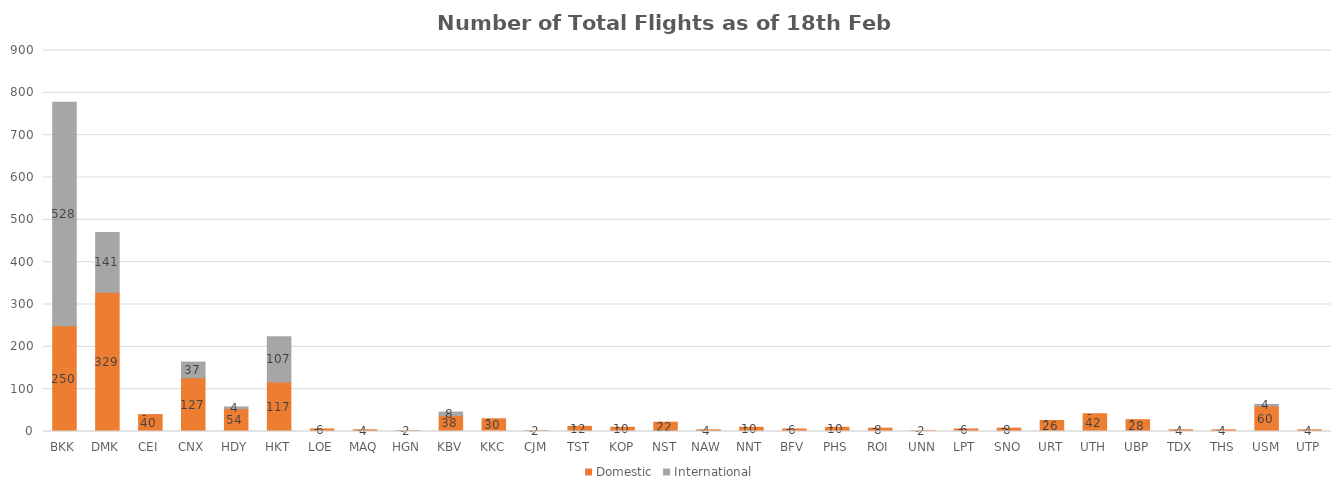
| Category | Domestic | International |
|---|---|---|
| BKK | 250 | 528 |
| DMK | 329 | 141 |
| CEI | 40 | 0 |
| CNX | 127 | 37 |
| HDY | 54 | 4 |
| HKT | 117 | 107 |
| LOE | 6 | 0 |
| MAQ | 4 | 0 |
| HGN | 2 | 0 |
| KBV | 38 | 8 |
| KKC | 30 | 0 |
| CJM | 2 | 0 |
| TST | 12 | 0 |
| KOP | 10 | 0 |
| NST | 22 | 0 |
| NAW | 4 | 0 |
| NNT | 10 | 0 |
| BFV | 6 | 0 |
| PHS | 10 | 0 |
| ROI | 8 | 0 |
| UNN | 2 | 0 |
| LPT | 6 | 0 |
| SNO | 8 | 0 |
| URT | 26 | 0 |
| UTH | 42 | 0 |
| UBP | 28 | 0 |
| TDX | 4 | 0 |
| THS | 4 | 0 |
| USM | 60 | 4 |
| UTP | 4 | 0 |